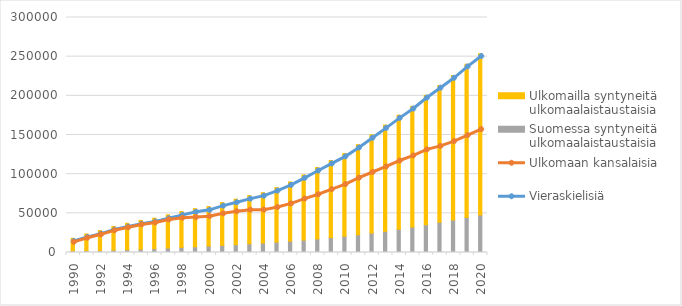
| Category | Suomessa syntyneitä ulkomaalaistaustaisia  | Ulkomailla syntyneitä ulkomaalaistaustaisia  |
|---|---|---|
| 1990 | 2131 | 15998 |
| 1991 | 2300 | 21352 |
| 1992 | 2532 | 25472 |
| 1993 | 2965 | 30351 |
| 1994 | 3526 | 33737 |
| 1995 | 4158 | 36848 |
| 1996 | 4819 | 38963 |
| 1997 | 5644 | 42500 |
| 1998 | 6466 | 45840 |
| 1999 | 7317 | 48657 |
| 2000 | 8168 | 50490 |
| 2001 | 9071 | 54684 |
| 2002 | 10017 | 58084 |
| 2003 | 11077 | 61563 |
| 2004 | 12085 | 64268 |
| 2005 | 13265 | 69608 |
| 2006 | 14469 | 75652 |
| 2007 | 15810 | 83274 |
| 2008 | 17324 | 91225 |
| 2009 | 18956 | 98480 |
| 2010 | 20683 | 105767 |
| 2011 | 22621 | 115091 |
| 2012 | 24719 | 125499 |
| 2013 | 27067 | 135626 |
| 2014 | 29647 | 145689 |
| 2015 | 32372 | 154249 |
| 2016 | 35432 | 165335 |
| 2017 | 38492 | 174798 |
| 2018 | 41583 | 184276 |
| 2019 | 44704 | 195731 |
| 2020 | 47893 | 205873 |